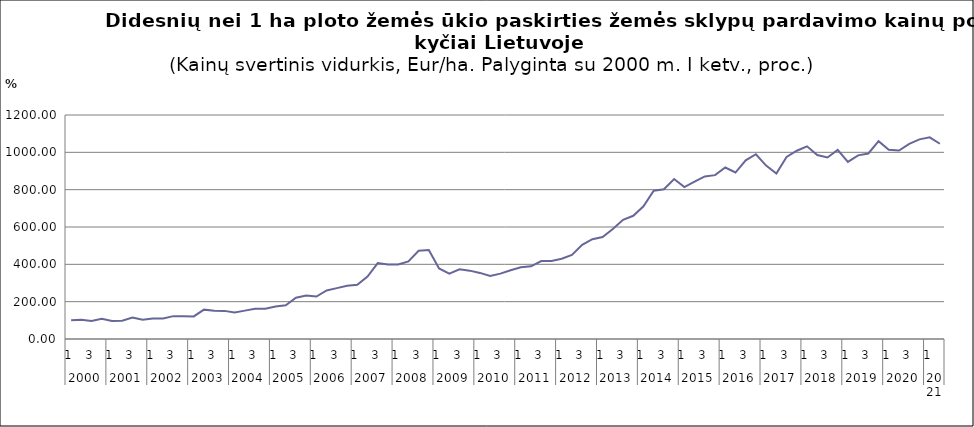
| Category | Series 0 |
|---|---|
| 0 | 100 |
| 1 | 103.425 |
| 2 | 96.525 |
| 3 | 107.926 |
| 4 | 96.693 |
| 5 | 98.323 |
| 6 | 114.808 |
| 7 | 102.722 |
| 8 | 109.958 |
| 9 | 110.372 |
| 10 | 122.529 |
| 11 | 121.621 |
| 12 | 120.978 |
| 13 | 157.337 |
| 14 | 151.754 |
| 15 | 150.613 |
| 16 | 141.949 |
| 17 | 152.08 |
| 18 | 162.409 |
| 19 | 162.342 |
| 20 | 174.001 |
| 21 | 180.742 |
| 22 | 220.727 |
| 23 | 232.405 |
| 24 | 227.467 |
| 25 | 260.189 |
| 26 | 272.595 |
| 27 | 285.087 |
| 28 | 290.135 |
| 29 | 334.88 |
| 30 | 406.772 |
| 31 | 399.36 |
| 32 | 399.684 |
| 33 | 415.516 |
| 34 | 472.636 |
| 35 | 477.075 |
| 36 | 377.924 |
| 37 | 350.3 |
| 38 | 373.576 |
| 39 | 366.229 |
| 40 | 354.112 |
| 41 | 337.264 |
| 42 | 350.276 |
| 43 | 368.488 |
| 44 | 384.273 |
| 45 | 389.207 |
| 46 | 417.218 |
| 47 | 418.165 |
| 48 | 429.724 |
| 49 | 450.834 |
| 50 | 504.133 |
| 51 | 534.655 |
| 52 | 546.689 |
| 53 | 589.09 |
| 54 | 638.358 |
| 55 | 660.04 |
| 56 | 710.583 |
| 57 | 794.792 |
| 58 | 802.546 |
| 59 | 856.967 |
| 60 | 814.046 |
| 61 | 842.583 |
| 62 | 871.084 |
| 63 | 877.926 |
| 64 | 918.547 |
| 65 | 891.851 |
| 66 | 956.914 |
| 67 | 989.866 |
| 68 | 928.786 |
| 69 | 886.27 |
| 70 | 975.401 |
| 71 | 1008.528 |
| 72 | 1032.293 |
| 73 | 985.211 |
| 74 | 972.587 |
| 75 | 1012.972 |
| 76 | 948.819 |
| 77 | 983.851 |
| 78 | 993.905 |
| 79 | 1059.938 |
| 80 | 1013.938 |
| 81 | 1009.586 |
| 82 | 1045.643 |
| 83 | 1069.539 |
| 84 | 1080.277 |
| 85 | 1045.952 |